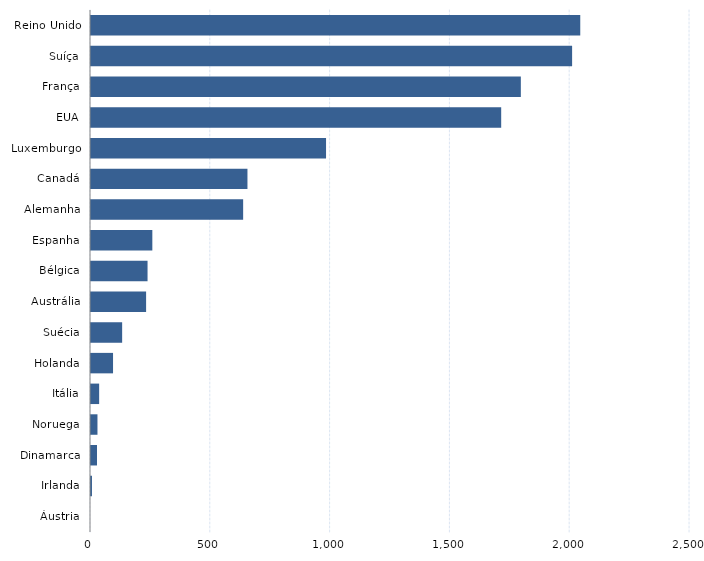
| Category | Series 0 |
|---|---|
| Áustria | 0 |
| Irlanda | 4 |
| Dinamarca | 25 |
| Noruega | 27 |
| Itália | 34 |
| Holanda | 92 |
| Suécia | 130 |
| Austrália | 230 |
| Bélgica | 236 |
| Espanha | 256 |
| Alemanha | 635 |
| Canadá | 653 |
| Luxemburgo | 981 |
| EUA | 1712 |
| França | 1794 |
| Suíça | 2008 |
| Reino Unido | 2042 |